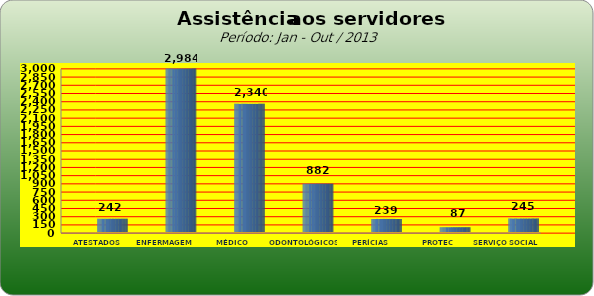
| Category | Series 0 |
|---|---|
| ATESTADOS MÉDICOS | 242 |
| ENFERMAGEM | 2984 |
| MÉDICO | 2340 |
| ODONTOLÓGICOS | 882 |
| PERÍCIAS MÉDICAS | 239 |
| PROTEC | 87 |
| SERVIÇO SOCIAL | 245 |